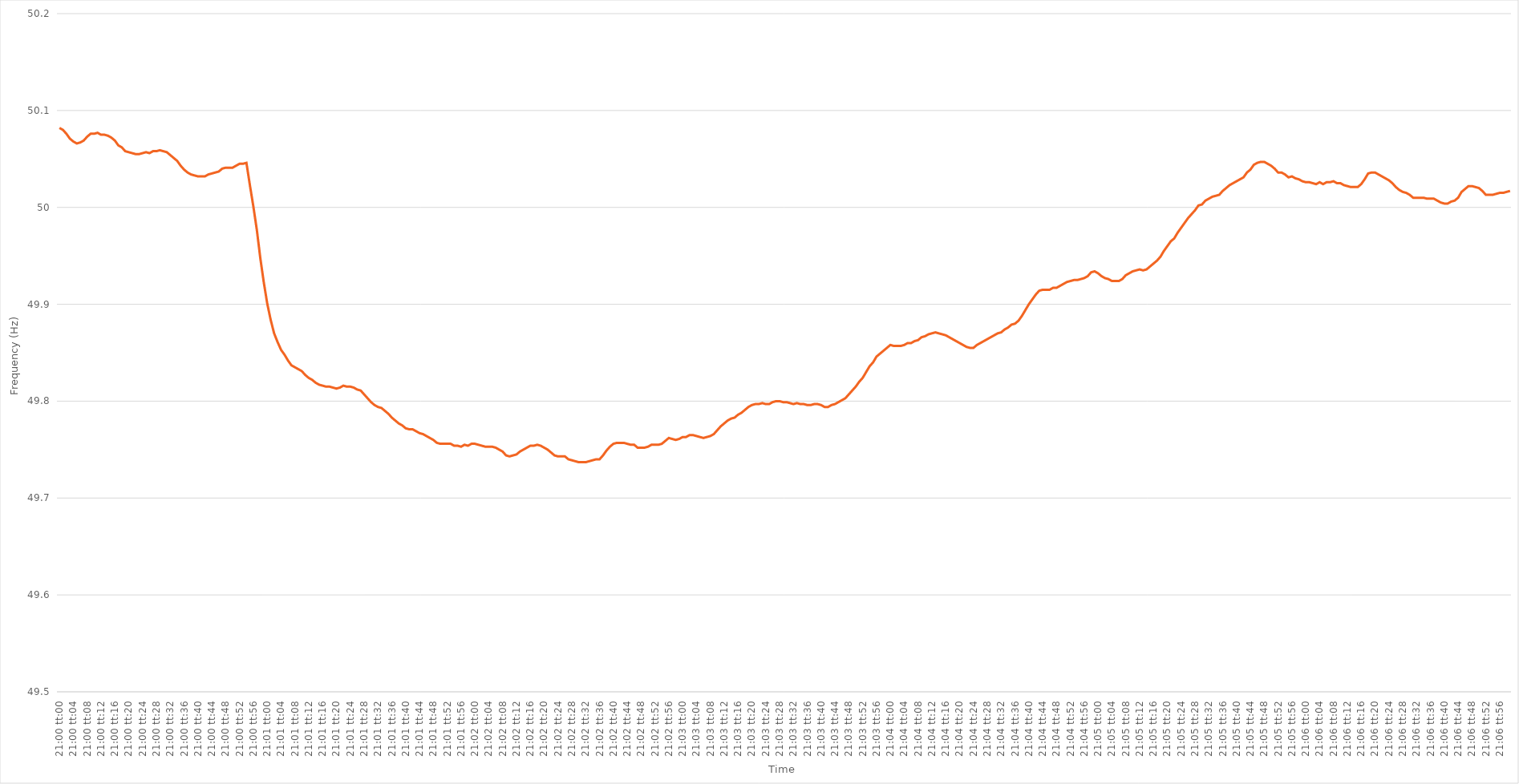
| Category | Series 0 |
|---|---|
| 0.875 | 50.082 |
| 0.8750115740740741 | 50.08 |
| 0.8750231481481481 | 50.076 |
| 0.8750347222222222 | 50.071 |
| 0.8750462962962963 | 50.068 |
| 0.8750578703703704 | 50.066 |
| 0.8750694444444443 | 50.067 |
| 0.8750810185185185 | 50.069 |
| 0.8750925925925926 | 50.073 |
| 0.8751041666666667 | 50.076 |
| 0.8751157407407407 | 50.076 |
| 0.8751273148148148 | 50.077 |
| 0.8751388888888889 | 50.075 |
| 0.8751504629629631 | 50.075 |
| 0.875162037037037 | 50.074 |
| 0.8751736111111111 | 50.072 |
| 0.8751851851851852 | 50.069 |
| 0.8751967592592593 | 50.064 |
| 0.8752083333333333 | 50.062 |
| 0.8752199074074074 | 50.058 |
| 0.8752314814814816 | 50.057 |
| 0.8752430555555555 | 50.056 |
| 0.8752546296296296 | 50.055 |
| 0.8752662037037037 | 50.055 |
| 0.8752777777777778 | 50.056 |
| 0.8752893518518517 | 50.057 |
| 0.8753009259259259 | 50.056 |
| 0.8753125 | 50.058 |
| 0.8753240740740741 | 50.058 |
| 0.8753356481481481 | 50.059 |
| 0.8753472222222222 | 50.058 |
| 0.8753587962962963 | 50.057 |
| 0.8753703703703705 | 50.054 |
| 0.8753819444444444 | 50.051 |
| 0.8753935185185185 | 50.048 |
| 0.8754050925925926 | 50.043 |
| 0.8754166666666667 | 50.039 |
| 0.8754282407407407 | 50.036 |
| 0.8754398148148148 | 50.034 |
| 0.875451388888889 | 50.033 |
| 0.875462962962963 | 50.032 |
| 0.875474537037037 | 50.032 |
| 0.8754861111111111 | 50.032 |
| 0.8754976851851852 | 50.034 |
| 0.8755092592592592 | 50.035 |
| 0.8755208333333333 | 50.036 |
| 0.8755324074074075 | 50.037 |
| 0.8755439814814815 | 50.04 |
| 0.8755555555555555 | 50.041 |
| 0.8755671296296296 | 50.041 |
| 0.8755787037037037 | 50.041 |
| 0.8755902777777779 | 50.043 |
| 0.8756018518518518 | 50.045 |
| 0.875613425925926 | 50.045 |
| 0.875625 | 50.046 |
| 0.8756365740740741 | 50.023 |
| 0.8756481481481481 | 50.001 |
| 0.8756597222222222 | 49.977 |
| 0.8756712962962964 | 49.948 |
| 0.8756828703703704 | 49.923 |
| 0.8756944444444444 | 49.901 |
| 0.8757060185185185 | 49.884 |
| 0.8757175925925926 | 49.87 |
| 0.8757291666666666 | 49.861 |
| 0.8757407407407407 | 49.853 |
| 0.8757523148148149 | 49.848 |
| 0.8757638888888889 | 49.842 |
| 0.8757754629629629 | 49.837 |
| 0.875787037037037 | 49.835 |
| 0.8757986111111111 | 49.833 |
| 0.8758101851851853 | 49.831 |
| 0.8758217592592592 | 49.827 |
| 0.8758333333333334 | 49.824 |
| 0.8758449074074074 | 49.822 |
| 0.8758564814814815 | 49.819 |
| 0.8758680555555555 | 49.817 |
| 0.8758796296296296 | 49.816 |
| 0.8758912037037038 | 49.815 |
| 0.8759027777777778 | 49.815 |
| 0.8759143518518518 | 49.814 |
| 0.8759259259259259 | 49.813 |
| 0.8759375 | 49.814 |
| 0.875949074074074 | 49.816 |
| 0.8759606481481481 | 49.815 |
| 0.8759722222222223 | 49.815 |
| 0.8759837962962963 | 49.814 |
| 0.8759953703703703 | 49.812 |
| 0.8760069444444444 | 49.811 |
| 0.8760185185185185 | 49.807 |
| 0.8760300925925927 | 49.803 |
| 0.8760416666666666 | 49.799 |
| 0.8760532407407408 | 49.796 |
| 0.8760648148148148 | 49.794 |
| 0.876076388888889 | 49.793 |
| 0.8760879629629629 | 49.79 |
| 0.876099537037037 | 49.787 |
| 0.8761111111111112 | 49.783 |
| 0.8761226851851852 | 49.78 |
| 0.8761342592592593 | 49.777 |
| 0.8761458333333333 | 49.775 |
| 0.8761574074074074 | 49.772 |
| 0.8761689814814816 | 49.771 |
| 0.8761805555555555 | 49.771 |
| 0.8761921296296297 | 49.769 |
| 0.8762037037037037 | 49.767 |
| 0.8762152777777777 | 49.766 |
| 0.8762268518518518 | 49.764 |
| 0.8762384259259259 | 49.762 |
| 0.8762500000000001 | 49.76 |
| 0.876261574074074 | 49.757 |
| 0.8762731481481482 | 49.756 |
| 0.8762847222222222 | 49.756 |
| 0.8762962962962964 | 49.756 |
| 0.8763078703703703 | 49.756 |
| 0.8763194444444444 | 49.754 |
| 0.8763310185185186 | 49.754 |
| 0.8763425925925926 | 49.753 |
| 0.8763541666666667 | 49.755 |
| 0.8763657407407407 | 49.754 |
| 0.8763773148148148 | 49.756 |
| 0.876388888888889 | 49.756 |
| 0.8764004629629629 | 49.755 |
| 0.8764120370370371 | 49.754 |
| 0.8764236111111111 | 49.753 |
| 0.8764351851851852 | 49.753 |
| 0.8764467592592592 | 49.753 |
| 0.8764583333333333 | 49.752 |
| 0.8764699074074075 | 49.75 |
| 0.8764814814814814 | 49.748 |
| 0.8764930555555556 | 49.744 |
| 0.8765046296296296 | 49.743 |
| 0.8765162037037038 | 49.744 |
| 0.8765277777777777 | 49.745 |
| 0.8765393518518518 | 49.748 |
| 0.876550925925926 | 49.75 |
| 0.8765625 | 49.752 |
| 0.8765740740740741 | 49.754 |
| 0.8765856481481481 | 49.754 |
| 0.8765972222222222 | 49.755 |
| 0.8766087962962964 | 49.754 |
| 0.8766203703703703 | 49.752 |
| 0.8766319444444445 | 49.75 |
| 0.8766435185185185 | 49.747 |
| 0.8766550925925927 | 49.744 |
| 0.8766666666666666 | 49.743 |
| 0.8766782407407407 | 49.743 |
| 0.8766898148148149 | 49.743 |
| 0.8767013888888888 | 49.74 |
| 0.876712962962963 | 49.739 |
| 0.876724537037037 | 49.738 |
| 0.8767361111111112 | 49.737 |
| 0.8767476851851851 | 49.737 |
| 0.8767592592592592 | 49.737 |
| 0.8767708333333334 | 49.738 |
| 0.8767824074074074 | 49.739 |
| 0.8767939814814815 | 49.74 |
| 0.8768055555555555 | 49.74 |
| 0.8768171296296297 | 49.744 |
| 0.8768287037037038 | 49.749 |
| 0.8768402777777777 | 49.753 |
| 0.8768518518518519 | 49.756 |
| 0.8768634259259259 | 49.757 |
| 0.8768750000000001 | 49.757 |
| 0.876886574074074 | 49.757 |
| 0.8768981481481481 | 49.756 |
| 0.8769097222222223 | 49.755 |
| 0.8769212962962962 | 49.755 |
| 0.8769328703703704 | 49.752 |
| 0.8769444444444444 | 49.752 |
| 0.8769560185185186 | 49.752 |
| 0.8769675925925925 | 49.753 |
| 0.8769791666666666 | 49.755 |
| 0.8769907407407408 | 49.755 |
| 0.8770023148148148 | 49.755 |
| 0.8770138888888889 | 49.756 |
| 0.8770254629629629 | 49.759 |
| 0.8770370370370371 | 49.762 |
| 0.8770486111111112 | 49.761 |
| 0.8770601851851851 | 49.76 |
| 0.8770717592592593 | 49.761 |
| 0.8770833333333333 | 49.763 |
| 0.8770949074074075 | 49.763 |
| 0.8771064814814814 | 49.765 |
| 0.8771180555555556 | 49.765 |
| 0.8771296296296297 | 49.764 |
| 0.8771412037037036 | 49.763 |
| 0.8771527777777778 | 49.762 |
| 0.8771643518518518 | 49.763 |
| 0.877175925925926 | 49.764 |
| 0.8771874999999999 | 49.766 |
| 0.877199074074074 | 49.77 |
| 0.8772106481481482 | 49.774 |
| 0.8772222222222222 | 49.777 |
| 0.8772337962962963 | 49.78 |
| 0.8772453703703703 | 49.782 |
| 0.8772569444444445 | 49.783 |
| 0.8772685185185186 | 49.786 |
| 0.8772800925925925 | 49.788 |
| 0.8772916666666667 | 49.791 |
| 0.8773032407407407 | 49.794 |
| 0.8773148148148149 | 49.796 |
| 0.8773263888888888 | 49.797 |
| 0.877337962962963 | 49.797 |
| 0.8773495370370371 | 49.798 |
| 0.8773611111111111 | 49.797 |
| 0.8773726851851852 | 49.797 |
| 0.8773842592592592 | 49.799 |
| 0.8773958333333334 | 49.8 |
| 0.8774074074074073 | 49.8 |
| 0.8774189814814815 | 49.799 |
| 0.8774305555555556 | 49.799 |
| 0.8774421296296296 | 49.798 |
| 0.8774537037037037 | 49.797 |
| 0.8774652777777777 | 49.798 |
| 0.8774768518518519 | 49.797 |
| 0.877488425925926 | 49.797 |
| 0.8775 | 49.796 |
| 0.8775115740740741 | 49.796 |
| 0.8775231481481481 | 49.797 |
| 0.8775347222222223 | 49.797 |
| 0.8775462962962962 | 49.796 |
| 0.8775578703703704 | 49.794 |
| 0.8775694444444445 | 49.794 |
| 0.8775810185185186 | 49.796 |
| 0.8775925925925926 | 49.797 |
| 0.8776041666666666 | 49.799 |
| 0.8776157407407408 | 49.801 |
| 0.8776273148148147 | 49.803 |
| 0.8776388888888889 | 49.807 |
| 0.877650462962963 | 49.811 |
| 0.877662037037037 | 49.815 |
| 0.8776736111111111 | 49.82 |
| 0.8776851851851851 | 49.824 |
| 0.8776967592592593 | 49.83 |
| 0.8777083333333334 | 49.836 |
| 0.8777199074074074 | 49.84 |
| 0.8777314814814815 | 49.846 |
| 0.8777430555555555 | 49.849 |
| 0.8777546296296297 | 49.852 |
| 0.8777662037037036 | 49.855 |
| 0.8777777777777778 | 49.858 |
| 0.8777893518518519 | 49.857 |
| 0.877800925925926 | 49.857 |
| 0.8778125 | 49.857 |
| 0.877824074074074 | 49.858 |
| 0.8778356481481482 | 49.86 |
| 0.8778472222222221 | 49.86 |
| 0.8778587962962963 | 49.862 |
| 0.8778703703703704 | 49.863 |
| 0.8778819444444445 | 49.866 |
| 0.8778935185185185 | 49.867 |
| 0.8779050925925925 | 49.869 |
| 0.8779166666666667 | 49.87 |
| 0.8779282407407408 | 49.871 |
| 0.8779398148148148 | 49.87 |
| 0.8779513888888889 | 49.869 |
| 0.877962962962963 | 49.868 |
| 0.8779745370370371 | 49.866 |
| 0.877986111111111 | 49.864 |
| 0.8779976851851852 | 49.862 |
| 0.8780092592592593 | 49.86 |
| 0.8780208333333334 | 49.858 |
| 0.8780324074074074 | 49.856 |
| 0.8780439814814814 | 49.855 |
| 0.8780555555555556 | 49.855 |
| 0.8780671296296297 | 49.858 |
| 0.8780787037037037 | 49.86 |
| 0.8780902777777778 | 49.862 |
| 0.8781018518518519 | 49.864 |
| 0.8781134259259259 | 49.866 |
| 0.8781249999999999 | 49.868 |
| 0.8781365740740741 | 49.87 |
| 0.8781481481481482 | 49.871 |
| 0.8781597222222222 | 49.874 |
| 0.8781712962962963 | 49.876 |
| 0.8781828703703703 | 49.879 |
| 0.8781944444444445 | 49.88 |
| 0.8782060185185184 | 49.883 |
| 0.8782175925925926 | 49.888 |
| 0.8782291666666667 | 49.894 |
| 0.8782407407407408 | 49.9 |
| 0.8782523148148148 | 49.905 |
| 0.8782638888888888 | 49.91 |
| 0.878275462962963 | 49.914 |
| 0.8782870370370371 | 49.915 |
| 0.8782986111111111 | 49.915 |
| 0.8783101851851852 | 49.915 |
| 0.8783217592592593 | 49.917 |
| 0.8783333333333333 | 49.917 |
| 0.8783449074074073 | 49.919 |
| 0.8783564814814815 | 49.921 |
| 0.8783680555555556 | 49.923 |
| 0.8783796296296296 | 49.924 |
| 0.8783912037037037 | 49.925 |
| 0.8784027777777778 | 49.925 |
| 0.8784143518518519 | 49.926 |
| 0.8784259259259258 | 49.927 |
| 0.8784375 | 49.929 |
| 0.8784490740740741 | 49.933 |
| 0.8784606481481482 | 49.934 |
| 0.8784722222222222 | 49.932 |
| 0.8784837962962962 | 49.929 |
| 0.8784953703703704 | 49.927 |
| 0.8785069444444445 | 49.926 |
| 0.8785185185185185 | 49.924 |
| 0.8785300925925926 | 49.924 |
| 0.8785416666666667 | 49.924 |
| 0.8785532407407407 | 49.926 |
| 0.8785648148148147 | 49.93 |
| 0.8785763888888889 | 49.932 |
| 0.878587962962963 | 49.934 |
| 0.878599537037037 | 49.935 |
| 0.8786111111111111 | 49.936 |
| 0.8786226851851852 | 49.935 |
| 0.8786342592592593 | 49.936 |
| 0.8786458333333332 | 49.939 |
| 0.8786574074074074 | 49.942 |
| 0.8786689814814815 | 49.945 |
| 0.8786805555555556 | 49.949 |
| 0.8786921296296296 | 49.955 |
| 0.8787037037037037 | 49.96 |
| 0.8787152777777778 | 49.965 |
| 0.878726851851852 | 49.968 |
| 0.8787384259259259 | 49.974 |
| 0.87875 | 49.979 |
| 0.8787615740740741 | 49.984 |
| 0.8787731481481482 | 49.989 |
| 0.8787847222222221 | 49.993 |
| 0.8787962962962963 | 49.997 |
| 0.8788078703703704 | 50.002 |
| 0.8788194444444444 | 50.003 |
| 0.8788310185185185 | 50.007 |
| 0.8788425925925926 | 50.009 |
| 0.8788541666666667 | 50.011 |
| 0.8788657407407406 | 50.012 |
| 0.8788773148148148 | 50.013 |
| 0.8788888888888889 | 50.017 |
| 0.878900462962963 | 50.02 |
| 0.878912037037037 | 50.023 |
| 0.8789236111111111 | 50.025 |
| 0.8789351851851852 | 50.027 |
| 0.8789467592592594 | 50.029 |
| 0.8789583333333333 | 50.031 |
| 0.8789699074074074 | 50.036 |
| 0.8789814814814815 | 50.039 |
| 0.8789930555555556 | 50.044 |
| 0.8790046296296296 | 50.046 |
| 0.8790162037037037 | 50.047 |
| 0.8790277777777779 | 50.047 |
| 0.8790393518518518 | 50.045 |
| 0.8790509259259259 | 50.043 |
| 0.8790625 | 50.04 |
| 0.8790740740740741 | 50.036 |
| 0.879085648148148 | 50.036 |
| 0.8790972222222222 | 50.034 |
| 0.8791087962962963 | 50.031 |
| 0.8791203703703704 | 50.032 |
| 0.8791319444444444 | 50.03 |
| 0.8791435185185185 | 50.029 |
| 0.8791550925925926 | 50.027 |
| 0.8791666666666668 | 50.026 |
| 0.8791782407407407 | 50.026 |
| 0.8791898148148148 | 50.025 |
| 0.8792013888888889 | 50.024 |
| 0.879212962962963 | 50.026 |
| 0.879224537037037 | 50.024 |
| 0.8792361111111111 | 50.026 |
| 0.8792476851851853 | 50.026 |
| 0.8792592592592593 | 50.027 |
| 0.8792708333333333 | 50.025 |
| 0.8792824074074074 | 50.025 |
| 0.8792939814814815 | 50.023 |
| 0.8793055555555555 | 50.022 |
| 0.8793171296296296 | 50.021 |
| 0.8793287037037038 | 50.021 |
| 0.8793402777777778 | 50.021 |
| 0.8793518518518518 | 50.024 |
| 0.8793634259259259 | 50.029 |
| 0.879375 | 50.035 |
| 0.8793865740740742 | 50.036 |
| 0.8793981481481481 | 50.036 |
| 0.8794097222222222 | 50.034 |
| 0.8794212962962963 | 50.032 |
| 0.8794328703703704 | 50.03 |
| 0.8794444444444444 | 50.028 |
| 0.8794560185185185 | 50.025 |
| 0.8794675925925927 | 50.021 |
| 0.8794791666666667 | 50.018 |
| 0.8794907407407407 | 50.016 |
| 0.8795023148148148 | 50.015 |
| 0.8795138888888889 | 50.013 |
| 0.8795254629629629 | 50.01 |
| 0.879537037037037 | 50.01 |
| 0.8795486111111112 | 50.01 |
| 0.8795601851851852 | 50.01 |
| 0.8795717592592592 | 50.009 |
| 0.8795833333333333 | 50.009 |
| 0.8795949074074074 | 50.009 |
| 0.8796064814814816 | 50.007 |
| 0.8796180555555555 | 50.005 |
| 0.8796296296296297 | 50.004 |
| 0.8796412037037037 | 50.004 |
| 0.8796527777777778 | 50.006 |
| 0.8796643518518518 | 50.007 |
| 0.8796759259259259 | 50.01 |
| 0.8796875000000001 | 50.016 |
| 0.8796990740740741 | 50.019 |
| 0.8797106481481481 | 50.022 |
| 0.8797222222222222 | 50.022 |
| 0.8797337962962963 | 50.021 |
| 0.8797453703703703 | 50.02 |
| 0.8797569444444444 | 50.017 |
| 0.8797685185185186 | 50.013 |
| 0.8797800925925926 | 50.013 |
| 0.8797916666666666 | 50.013 |
| 0.8798032407407407 | 50.014 |
| 0.8798148148148148 | 50.015 |
| 0.879826388888889 | 50.015 |
| 0.8798379629629629 | 50.016 |
| 0.879849537037037 | 50.017 |